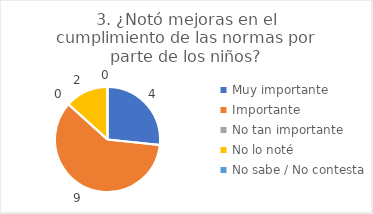
| Category | 3. ¿Notó mejoras en el cumplimiento de las normas por parte de los niños? |
|---|---|
| Muy importante  | 0.267 |
| Importante  | 0.6 |
| No tan importante  | 0 |
| No lo noté  | 0.133 |
| No sabe / No contesta | 0 |